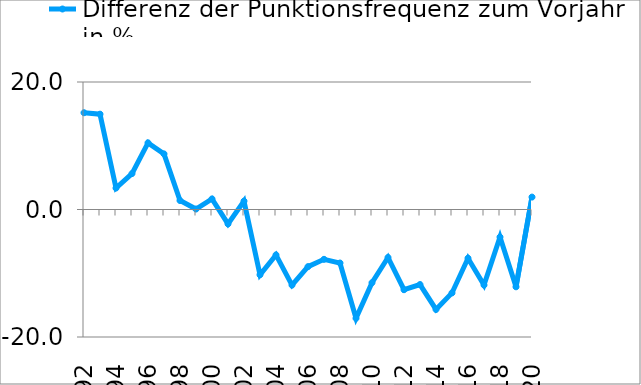
| Category | Differenz der Punktionsfrequenz zum Vorjahr in % |
|---|---|
| 1992 | 15.178 |
| 1993 | 14.951 |
| 1994 | 3.366 |
| 1995 | 5.633 |
| 1996 | 10.459 |
| 1997 | 8.719 |
| 1998 | 1.411 |
| 1999 | 0.072 |
| 2000 | 1.661 |
| 2001 | -2.26 |
| 2002 | 1.318 |
| 2003 | -10.238 |
| 2004 | -7.125 |
| 2005 | -11.86 |
| 2006 | -8.966 |
| 2007 | -7.816 |
| 2008 | -8.396 |
| 2009 | -17.067 |
| 2010 | -11.485 |
| 2011 | -7.526 |
| 2012 | -12.583 |
| 2013 | -11.777 |
| 2014 | -15.678 |
| 2015 | -13.086 |
| 2016 | -7.644 |
| 2017 | -11.848 |
| 2018 | -4.321 |
| 2019 | -12.126 |
| 2020 | 1.947 |